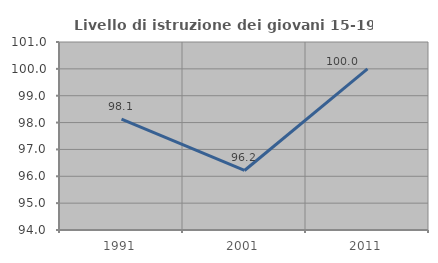
| Category | Livello di istruzione dei giovani 15-19 anni |
|---|---|
| 1991.0 | 98.127 |
| 2001.0 | 96.216 |
| 2011.0 | 100 |